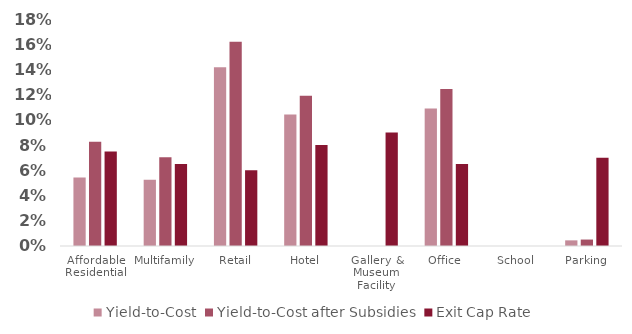
| Category | Yield-to-Cost | Yield-to-Cost after Subsidies | Exit Cap Rate |
|---|---|---|---|
| Affordable Residential | 0.054 | 0.083 | 0.075 |
| Multifamily | 0.052 | 0.07 | 0.065 |
| Retail | 0.142 | 0.162 | 0.06 |
| Hotel | 0.104 | 0.119 | 0.08 |
| Gallery & Museum Facility | 0 | 0 | 0.09 |
| Office | 0.109 | 0.125 | 0.065 |
| School | 0 | 0 | 0 |
| Parking | 0.004 | 0.005 | 0.07 |